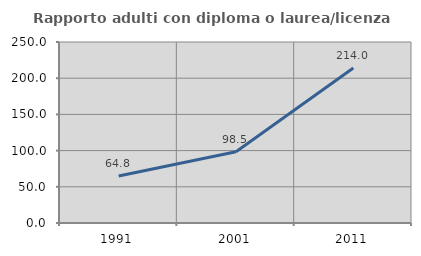
| Category | Rapporto adulti con diploma o laurea/licenza media  |
|---|---|
| 1991.0 | 64.825 |
| 2001.0 | 98.46 |
| 2011.0 | 213.988 |